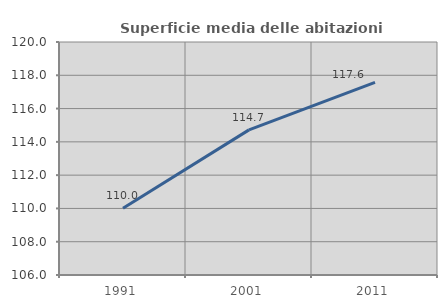
| Category | Superficie media delle abitazioni occupate |
|---|---|
| 1991.0 | 110.01 |
| 2001.0 | 114.72 |
| 2011.0 | 117.579 |